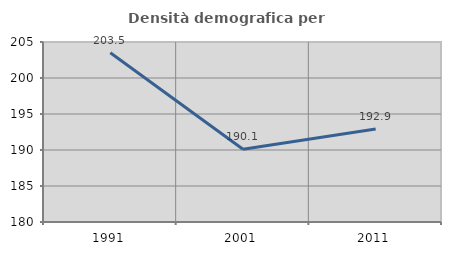
| Category | Densità demografica |
|---|---|
| 1991.0 | 203.499 |
| 2001.0 | 190.106 |
| 2011.0 | 192.921 |